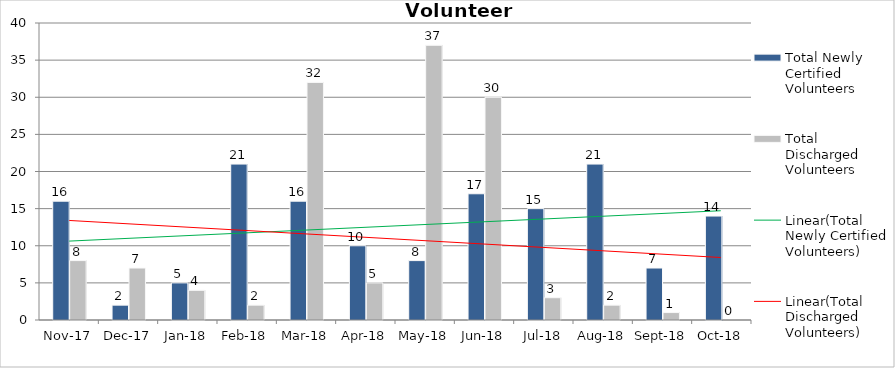
| Category | Total Newly Certified Volunteers | Total Discharged Volunteers |
|---|---|---|
| 2017-11-01 | 16 | 8 |
| 2017-12-01 | 2 | 7 |
| 2018-01-01 | 5 | 4 |
| 2018-02-01 | 21 | 2 |
| 2018-03-01 | 16 | 32 |
| 2018-04-01 | 10 | 5 |
| 2018-05-01 | 8 | 37 |
| 2018-06-01 | 17 | 30 |
| 2018-07-01 | 15 | 3 |
| 2018-08-01 | 21 | 2 |
| 2018-09-01 | 7 | 1 |
| 2018-10-01 | 14 | 0 |